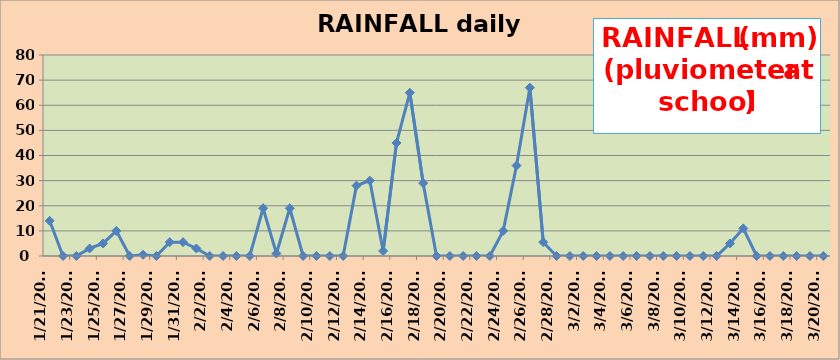
| Category | RAINFALL (mm) |
|---|---|
| 2019-01-21 | 14 |
| 2019-01-22 | 0 |
| 2019-01-23 | 0 |
| 2019-01-24 | 3 |
| 2019-01-25 | 5 |
| 2019-01-26 | 10 |
| 2019-01-27 | 0 |
| 2019-01-28 | 0.5 |
| 2019-01-29 | 0 |
| 2019-01-30 | 5.5 |
| 2019-01-31 | 5.5 |
| 2019-02-01 | 3 |
| 2019-02-02 | 0 |
| 2019-02-03 | 0 |
| 2019-02-04 | 0 |
| 2019-02-05 | 0 |
| 2019-02-06 | 19 |
| 2019-02-07 | 1 |
| 2019-02-08 | 19 |
| 2019-02-09 | 0 |
| 2019-02-10 | 0 |
| 2019-02-11 | 0 |
| 2019-02-12 | 0 |
| 2019-02-13 | 28 |
| 2019-02-14 | 30 |
| 2019-02-15 | 2 |
| 2019-02-16 | 45 |
| 2019-02-17 | 65 |
| 2019-02-18 | 29 |
| 2019-02-19 | 0 |
| 2019-02-20 | 0 |
| 2019-02-21 | 0 |
| 2019-02-22 | 0 |
| 2019-02-23 | 0 |
| 2019-02-24 | 10 |
| 2019-02-25 | 36 |
| 2019-02-26 | 67 |
| 2019-02-27 | 5.5 |
| 2019-02-28 | 0 |
| 2019-03-01 | 0 |
| 2019-03-02 | 0 |
| 2019-03-03 | 0 |
| 2019-03-04 | 0 |
| 2019-03-05 | 0 |
| 2019-03-06 | 0 |
| 2019-03-07 | 0 |
| 2019-03-08 | 0 |
| 2019-03-09 | 0 |
| 2019-03-10 | 0 |
| 2019-03-11 | 0 |
| 2019-03-12 | 0 |
| 2019-03-13 | 5 |
| 2019-03-14 | 11 |
| 2019-03-15 | 0 |
| 2019-03-16 | 0 |
| 2019-03-17 | 0 |
| 2019-03-18 | 0 |
| 2019-03-19 | 0 |
| 2019-03-20 | 0 |